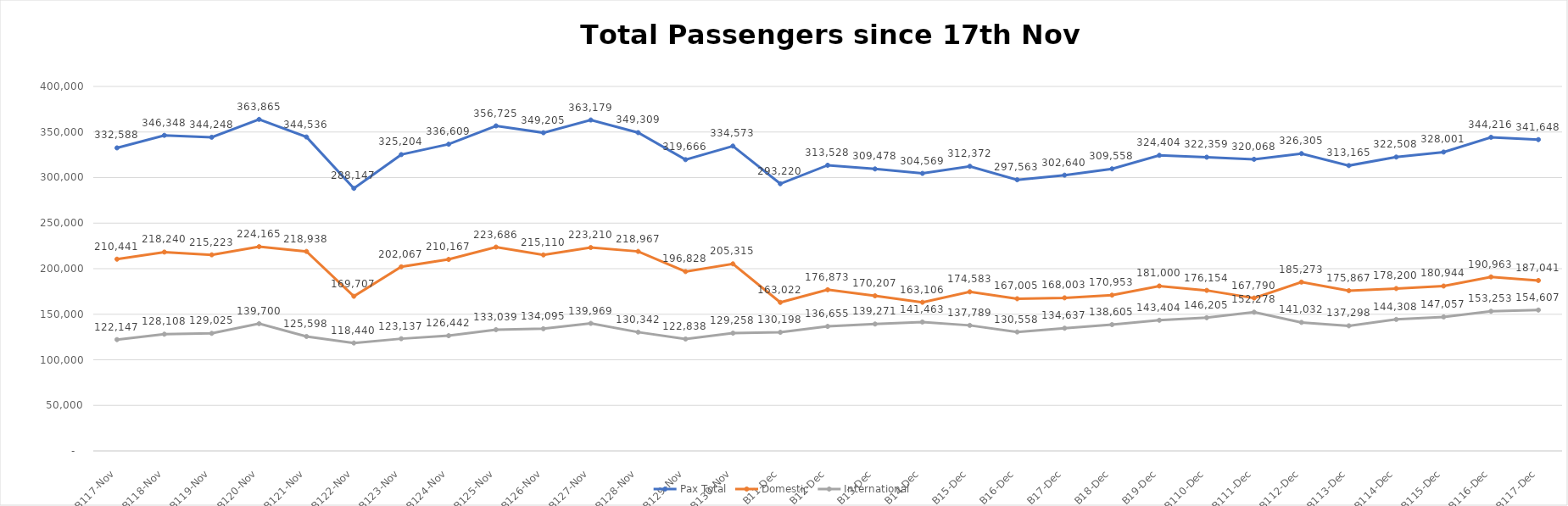
| Category | Pax Total |  Domestic  |  International  |
|---|---|---|---|
| 2022-11-17 | 332588 | 210441 | 122147 |
| 2022-11-18 | 346348 | 218240 | 128108 |
| 2022-11-19 | 344248 | 215223 | 129025 |
| 2022-11-20 | 363865 | 224165 | 139700 |
| 2022-11-21 | 344536 | 218938 | 125598 |
| 2022-11-22 | 288147 | 169707 | 118440 |
| 2022-11-23 | 325204 | 202067 | 123137 |
| 2022-11-24 | 336609 | 210167 | 126442 |
| 2022-11-25 | 356725 | 223686 | 133039 |
| 2022-11-26 | 349205 | 215110 | 134095 |
| 2022-11-27 | 363179 | 223210 | 139969 |
| 2022-11-28 | 349309 | 218967 | 130342 |
| 2022-11-29 | 319666 | 196828 | 122838 |
| 2022-11-30 | 334573 | 205315 | 129258 |
| 2022-12-01 | 293220 | 163022 | 130198 |
| 2022-12-02 | 313528 | 176873 | 136655 |
| 2022-12-03 | 309478 | 170207 | 139271 |
| 2022-12-04 | 304569 | 163106 | 141463 |
| 2022-12-05 | 312372 | 174583 | 137789 |
| 2022-12-06 | 297563 | 167005 | 130558 |
| 2022-12-07 | 302640 | 168003 | 134637 |
| 2022-12-08 | 309558 | 170953 | 138605 |
| 2022-12-09 | 324404 | 181000 | 143404 |
| 2022-12-10 | 322359 | 176154 | 146205 |
| 2022-12-11 | 320068 | 167790 | 152278 |
| 2022-12-12 | 326305 | 185273 | 141032 |
| 2022-12-13 | 313165 | 175867 | 137298 |
| 2022-12-14 | 322508 | 178200 | 144308 |
| 2022-12-15 | 328001 | 180944 | 147057 |
| 2022-12-16 | 344216 | 190963 | 153253 |
| 2022-12-17 | 341648 | 187041 | 154607 |